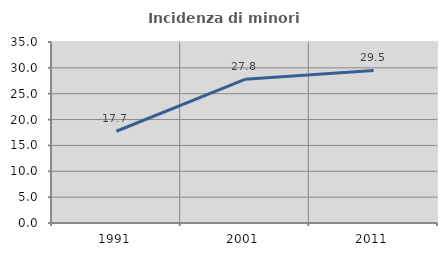
| Category | Incidenza di minori stranieri |
|---|---|
| 1991.0 | 17.742 |
| 2001.0 | 27.778 |
| 2011.0 | 29.496 |